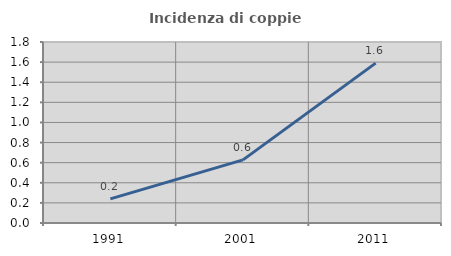
| Category | Incidenza di coppie miste |
|---|---|
| 1991.0 | 0.24 |
| 2001.0 | 0.628 |
| 2011.0 | 1.59 |